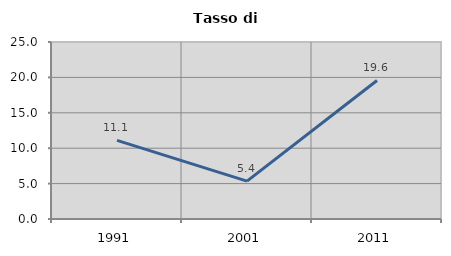
| Category | Tasso di disoccupazione   |
|---|---|
| 1991.0 | 11.111 |
| 2001.0 | 5.357 |
| 2011.0 | 19.565 |